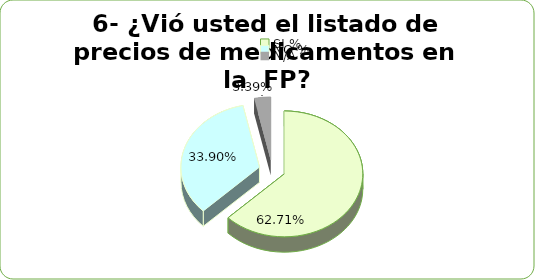
| Category | Series 0 |
|---|---|
| SI % | 0.627 |
| NO % | 0.339 |
| N/A | 0.034 |